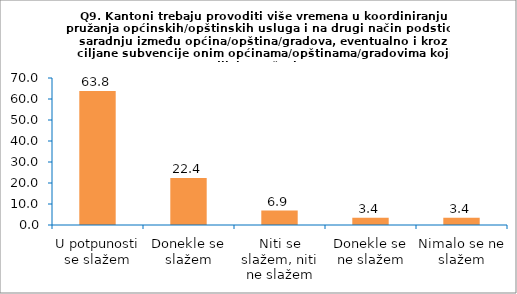
| Category | Series 0 |
|---|---|
| U potpunosti se slažem | 63.793 |
| Donekle se slažem | 22.414 |
| Niti se slažem, niti ne slažem | 6.897 |
| Donekle se ne slažem | 3.448 |
| Nimalo se ne slažem | 3.448 |